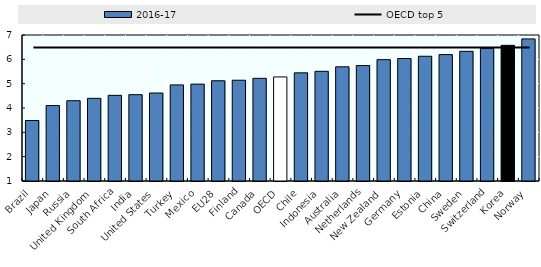
| Category | 2016-17 |
|---|---|
| Brazil | 3.486 |
| Japan | 4.099 |
| Russia | 4.299 |
| United Kingdom | 4.398 |
| South Africa | 4.52 |
| India | 4.548 |
| United States | 4.616 |
| Turkey | 4.949 |
| Mexico | 4.981 |
| EU28 | 5.12 |
| Finland | 5.141 |
| Canada | 5.219 |
| OECD | 5.276 |
| Chile | 5.445 |
| Indonesia | 5.507 |
| Australia | 5.692 |
| Netherlands | 5.743 |
| New Zealand | 5.988 |
| Germany | 6.032 |
| Estonia | 6.127 |
| China | 6.195 |
| Sweden | 6.329 |
| Switzerland | 6.45 |
| Korea | 6.576 |
| Norway | 6.84 |